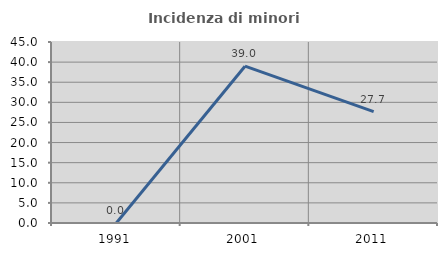
| Category | Incidenza di minori stranieri |
|---|---|
| 1991.0 | 0 |
| 2001.0 | 38.983 |
| 2011.0 | 27.711 |